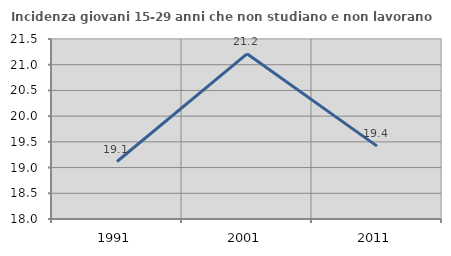
| Category | Incidenza giovani 15-29 anni che non studiano e non lavorano  |
|---|---|
| 1991.0 | 19.118 |
| 2001.0 | 21.212 |
| 2011.0 | 19.417 |